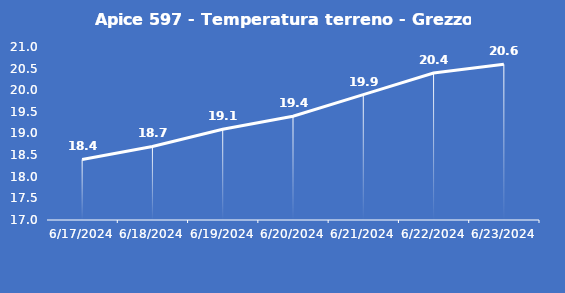
| Category | Apice 597 - Temperatura terreno - Grezzo (°C) |
|---|---|
| 6/17/24 | 18.4 |
| 6/18/24 | 18.7 |
| 6/19/24 | 19.1 |
| 6/20/24 | 19.4 |
| 6/21/24 | 19.9 |
| 6/22/24 | 20.4 |
| 6/23/24 | 20.6 |